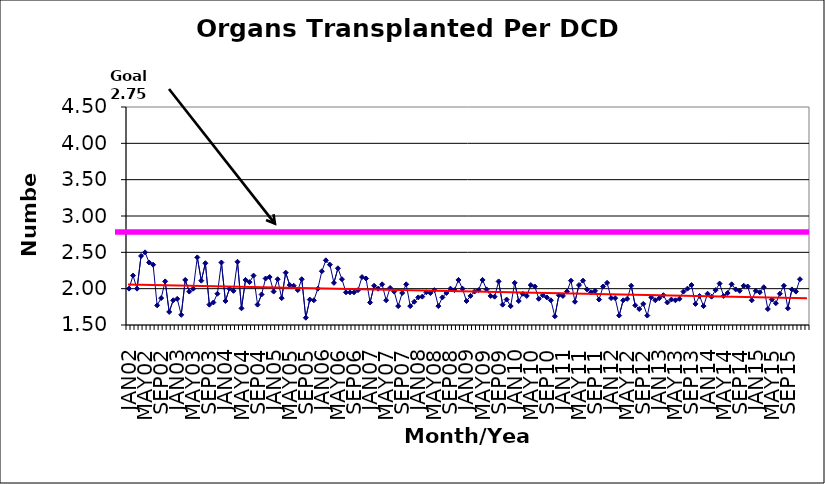
| Category | Series 0 |
|---|---|
| JAN02 | 2 |
| FEB02 | 2.18 |
| MAR02 | 2 |
| APR02 | 2.45 |
| MAY02 | 2.5 |
| JUN02 | 2.36 |
| JUL02 | 2.33 |
| AUG02 | 1.77 |
| SEP02 | 1.87 |
| OCT02 | 2.1 |
| NOV02 | 1.68 |
| DEC02 | 1.84 |
| JAN03 | 1.86 |
| FEB03 | 1.64 |
| MAR03 | 2.12 |
| APR03 | 1.96 |
| MAY03 | 2 |
| JUN03 | 2.43 |
| JUL03 | 2.11 |
| AUG03 | 2.35 |
| SEP03 | 1.78 |
| OCT03 | 1.81 |
| NOV03 | 1.93 |
| DEC03 | 2.36 |
| JAN04 | 1.83 |
| FEB04 | 2 |
| MAR04 | 1.97 |
| APR04 | 2.37 |
| MAY04 | 1.73 |
| JUN04 | 2.12 |
| JUL04 | 2.09 |
| AUG04 | 2.18 |
| SEP04 | 1.78 |
| OCT04 | 1.92 |
| NOV04 | 2.14 |
| DEC04 | 2.16 |
| JAN05 | 1.96 |
| FEB05 | 2.13 |
| MAR05 | 1.87 |
| APR05 | 2.22 |
| MAY05 | 2.05 |
| JUN05 | 2.04 |
| JUL05 | 1.98 |
| AUG05 | 2.13 |
| SEP05 | 1.6 |
| OCT05 | 1.85 |
| NOV05 | 1.84 |
| DEC05 | 2 |
| JAN06 | 2.24 |
| FEB06 | 2.39 |
| MAR06 | 2.33 |
| APR06 | 2.08 |
| MAY06 | 2.28 |
| JUN06 | 2.13 |
| JUL06 | 1.95 |
| AUG06 | 1.95 |
| SEP06 | 1.95 |
| OCT06 | 1.98 |
| NOV06 | 2.16 |
| DEC06 | 2.14 |
| JAN07 | 1.81 |
| FEB07 | 2.04 |
| MAR07 | 2 |
| APR07 | 2.06 |
| MAY07 | 1.84 |
| JUN07 | 2.01 |
| JUL07 | 1.96 |
| AUG07 | 1.76 |
| SEP07 | 1.94 |
| OCT07 | 2.06 |
| NOV07 | 1.76 |
| DEC07 | 1.82 |
| JAN08 | 1.88 |
| FEB08 | 1.89 |
| MAR08 | 1.95 |
| APR08 | 1.94 |
| MAY08 | 1.98 |
| JUN08 | 1.76 |
| JUL08 | 1.88 |
| AUG08 | 1.94 |
| SEP08 | 2 |
| OCT08 | 1.98 |
| NOV08 | 2.12 |
| DEC08 | 2 |
| JAN09 | 1.83 |
| FEB09 | 1.9 |
| MAR09 | 1.96 |
| APR09 | 1.98 |
| MAY09 | 2.12 |
| JUN09 | 1.99 |
| JUL09 | 1.9 |
| AUG09 | 1.89 |
| SEP09 | 2.1 |
| OCT09 | 1.78 |
| NOV09 | 1.85 |
| DEC09 | 1.76 |
| JAN10 | 2.08 |
| FEB10 | 1.83 |
| MAR10 | 1.93 |
| APR10 | 1.9 |
| MAY10 | 2.05 |
| JUN10 | 2.03 |
| JUL10 | 1.86 |
| AUG10 | 1.91 |
| SEP10 | 1.88 |
| OCT10 | 1.84 |
| NOV10 | 1.62 |
| DEC10 | 1.91 |
| JAN11 | 1.9 |
| FEB11 | 1.96 |
| MAR11 | 2.11 |
| APR11 | 1.82 |
| MAY11 | 2.05 |
| JUN11 | 2.11 |
| JUL11 | 1.99 |
| AUG11 | 1.95 |
| SEP11 | 1.97 |
| OCT11 | 1.85 |
| NOV11 | 2.03 |
| DEC11 | 2.08 |
| JAN12 | 1.87 |
| FEB12 | 1.87 |
| MAR12 | 1.63 |
| APR12 | 1.84 |
| MAY12 | 1.86 |
| JUN12 | 2.04 |
| JUL12 | 1.77 |
| AUG12 | 1.72 |
| SEP12 | 1.79 |
| OCT12 | 1.63 |
| NOV12 | 1.88 |
| DEC12 | 1.84 |
| JAN13 | 1.87 |
| FEB13 | 1.91 |
| MAR13 | 1.81 |
| APR13 | 1.85 |
| MAY13 | 1.84 |
| JUN13 | 1.86 |
| JUL13 | 1.96 |
| AUG13 | 2 |
| SEP13 | 2.05 |
| OCT13 | 1.79 |
| NOV13 | 1.9 |
| DEC13 | 1.76 |
| JAN14 | 1.93 |
| FEB14 | 1.89 |
| MAR14 | 1.98 |
| APR14 | 2.07 |
| MAY14 | 1.9 |
| JUN14 | 1.94 |
| JUL14 | 2.06 |
| AUG14 | 1.99 |
| SEP14 | 1.97 |
| OCT14 | 2.04 |
| NOV14 | 2.03 |
| DEC14 | 1.84 |
| JAN15 | 1.97 |
| FEB15 | 1.95 |
| MAR15 | 2.02 |
| APR15 | 1.72 |
| MAY15 | 1.85 |
| JUN15 | 1.8 |
| JUL15 | 1.93 |
| AUG15 | 2.04 |
| SEP15 | 1.73 |
| OCT15 | 1.99 |
| NOV15 | 1.96 |
| DEC15 | 2.13 |